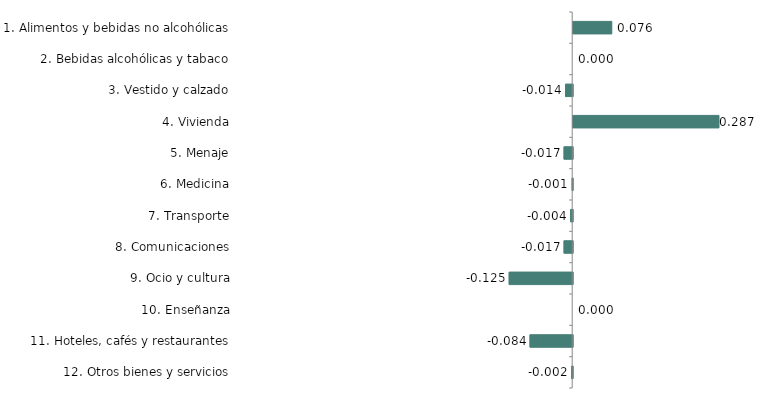
| Category | Series 0 |
|---|---|
| 1. Alimentos y bebidas no alcohólicas | 0.076 |
| 2. Bebidas alcohólicas y tabaco | 0 |
| 3. Vestido y calzado | -0.014 |
| 4. Vivienda | 0.287 |
| 5. Menaje | -0.017 |
| 6. Medicina | -0.001 |
| 7. Transporte | -0.004 |
| 8. Comunicaciones | -0.017 |
| 9. Ocio y cultura | -0.125 |
| 10. Enseñanza | 0 |
| 11. Hoteles, cafés y restaurantes | -0.084 |
| 12. Otros bienes y servicios | -0.002 |